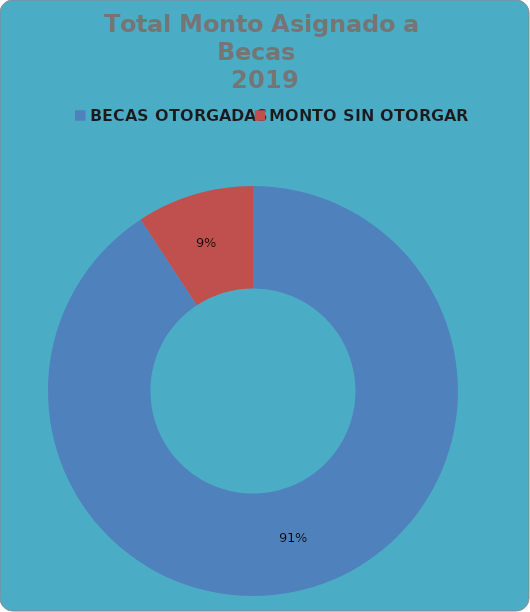
| Category | Series 0 |
|---|---|
| BECAS OTORGADAS | 1002106.01 |
| MONTO SIN OTORGAR | 101927.99 |